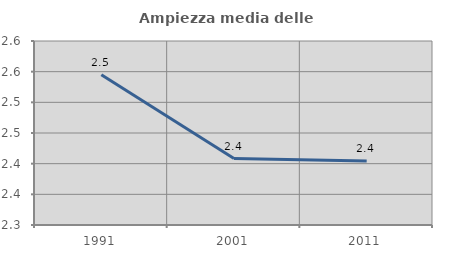
| Category | Ampiezza media delle famiglie |
|---|---|
| 1991.0 | 2.545 |
| 2001.0 | 2.408 |
| 2011.0 | 2.404 |